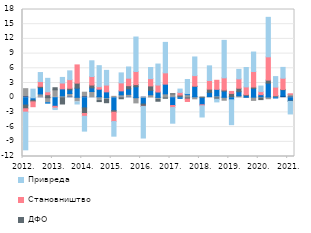
| Category | Непрофитне и друге организације | Локални ниво власти | Готов новац у oптицају | ДФО | Становништво | Привреда  |
|---|---|---|---|---|---|---|
| 2012. | 0.202 | 1.641 | -1.502 | -0.756 | -0.691 | -7.686 |
| II | 0.002 | -0.188 | -0.341 | -0.312 | -0.998 | 1.747 |
| III | 0.11 | 0.664 | 1.273 | 0.274 | 0.972 | 1.84 |
| IV | -0.138 | -0.873 | -0.098 | 0.61 | 0.594 | 2.749 |
| 2013. | 0.079 | 1.527 | -1.754 | 0.426 | -0.373 | -0.296 |
| II | 0.059 | 0.305 | 1.437 | -1.286 | 1.19 | 1.148 |
| III | 0.165 | 0.682 | 0.754 | 0.325 | 1.76 | 1.79 |
| IV | 0.076 | -0.87 | 1.873 | 1.027 | 3.718 | -0.415 |
| 2014. | 0.199 | 0.924 | -2.085 | -1.142 | -0.569 | -3.023 |
| II | 0.035 | 1.231 | 0.74 | 0.578 | 1.742 | 3.202 |
| III | 0.178 | -0.545 | 1.556 | -0.251 | 0.516 | 4.284 |
| IV | -0.104 | -0.237 | 1.19 | -0.68 | 1.391 | 3 |
| 2015. | -0.031 | 0.277 | -2.623 | -0.313 | -1.902 | -2.981 |
| II | 0.129 | 0.455 | 0.809 | -0.218 | 1.631 | 2.039 |
| III | 0.145 | 0.535 | 1.129 | 0.641 | 1.533 | 2.287 |
| IV | -0.109 | -1.155 | 2.237 | 0.437 | 2.676 | 7.032 |
| 2016. | 0.104 | -0.104 | -1.193 | -0.452 | -0.054 | -6.424 |
| II | -0.033 | 0.597 | 0.912 | 0.894 | 1.489 | 2.276 |
| III | 0.058 | -0.277 | 1.097 | -0.443 | 1.429 | 4.281 |
| IV | -0.001 | 0.781 | 1.984 | -0.118 | 2.31 | 6.213 |
| 2017. | 0.133 | 0.64 | -1.599 | 0.025 | -0.411 | -3.193 |
| II | 0.059 | 0.207 | -0.138 | 0.273 | 0.541 | 0.678 |
| III | 0.02 | 0.6 | 0.199 | -0.281 | -0.487 | 2.895 |
| IV | 0.183 | -0.435 | 2.116 | 0.066 | 2.148 | 3.798 |
| 2018. | -0.069 | 0.088 | -1.382 | 0.022 | -0.202 | -2.284 |
| II | 0.083 | 0.156 | 0.854 | 0.654 | 1.762 | 2.986 |
| III | 0.089 | 0.272 | 1.347 | -0.301 | 1.848 | -0.557 |
| IV | 0.082 | -0.727 | 1.258 | 0.234 | 2.481 | 7.641 |
| 2019. | 0.187 | 0.021 | -0.439 | 0.661 | 0.411 | -5.065 |
| II | -0.015 | 0.395 | 0.82 | 0.717 | 1.911 | 1.934 |
| III | 0.109 | -0.155 | 0.363 | 0.139 | 1.592 | 3.965 |
| IV | 0.106 | -0.756 | 1.801 | 0.269 | 3.171 | 3.974 |
| 2020. | -0.044 | 0.196 | 0.422 | -0.345 | 0.62 | 1.138 |
| II | 0.14 | -0.412 | 2.831 | 0.621 | 4.751 | 8.057 |
| III | 0.136 | 0.188 | -0.059 | 0.127 | 1.713 | 2.143 |
| IV | 0.323 | 0.01 | 1.279 | 0.077 | 2.288 | 2.209 |
| 2021. | 0.182 | 0.496 | -0.666 | -0.114 | 0.112 | -2.538 |